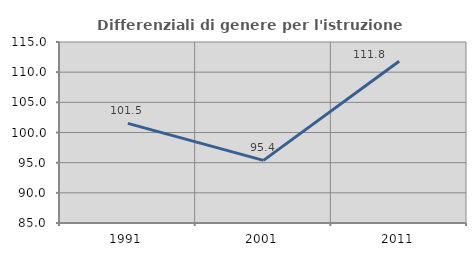
| Category | Differenziali di genere per l'istruzione superiore |
|---|---|
| 1991.0 | 101.513 |
| 2001.0 | 95.382 |
| 2011.0 | 111.802 |